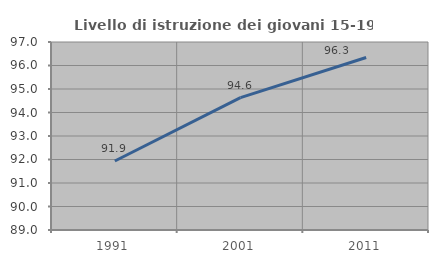
| Category | Livello di istruzione dei giovani 15-19 anni |
|---|---|
| 1991.0 | 91.935 |
| 2001.0 | 94.631 |
| 2011.0 | 96.341 |